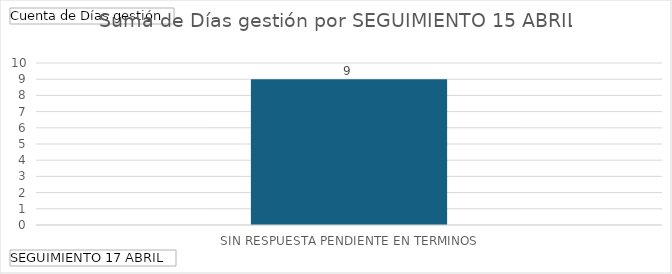
| Category | Total |
|---|---|
| SIN RESPUESTA PENDIENTE EN TERMINOS | 9 |